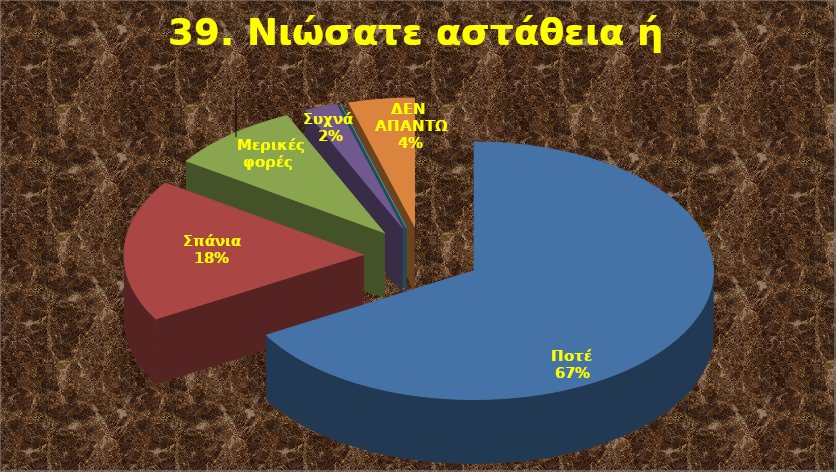
| Category | Series 0 |
|---|---|
| Ποτέ  | 30 |
| Σπάνια  | 8 |
| Μερικές φορές  | 4 |
| Συχνά  | 1 |
| Συνήθως  | 0 |
| ΔΕΝ ΑΠΑΝΤΩ | 2 |